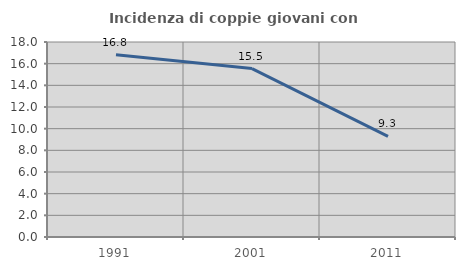
| Category | Incidenza di coppie giovani con figli |
|---|---|
| 1991.0 | 16.814 |
| 2001.0 | 15.55 |
| 2011.0 | 9.296 |